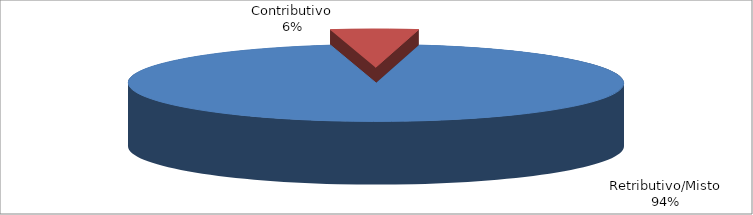
| Category | Decorrenti gennaio - settembre 2020 |
|---|---|
| Retributivo/Misto | 54019 |
| Contributivo | 3272 |